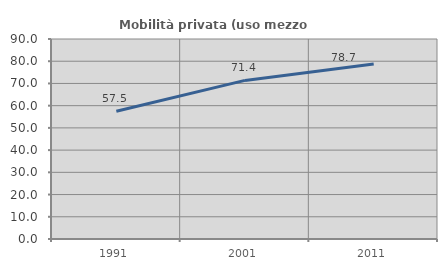
| Category | Mobilità privata (uso mezzo privato) |
|---|---|
| 1991.0 | 57.52 |
| 2001.0 | 71.364 |
| 2011.0 | 78.719 |